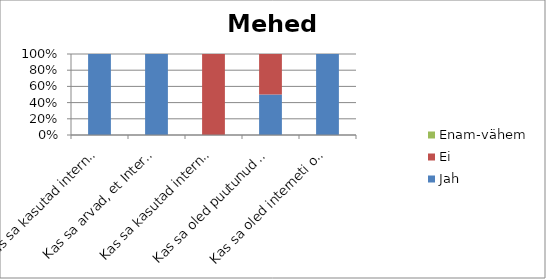
| Category | Jah | Ei | Enam-vähem |
|---|---|---|---|
| Kas sa kasutad internetti igapäevaselt? | 2 | 0 | 0 |
| Kas sa arvad, et Internet on turvaline? | 2 | 0 | 0 |
| Kas sa kasutad internetis suheldes veebikaamerat | 0 | 2 | 0 |
| Kas sa oled puutunud kokku probleemidega internetis? | 1 | 1 | 0 |
| Kas sa oled interneti ohtudest teadlik? | 2 | 0 | 0 |